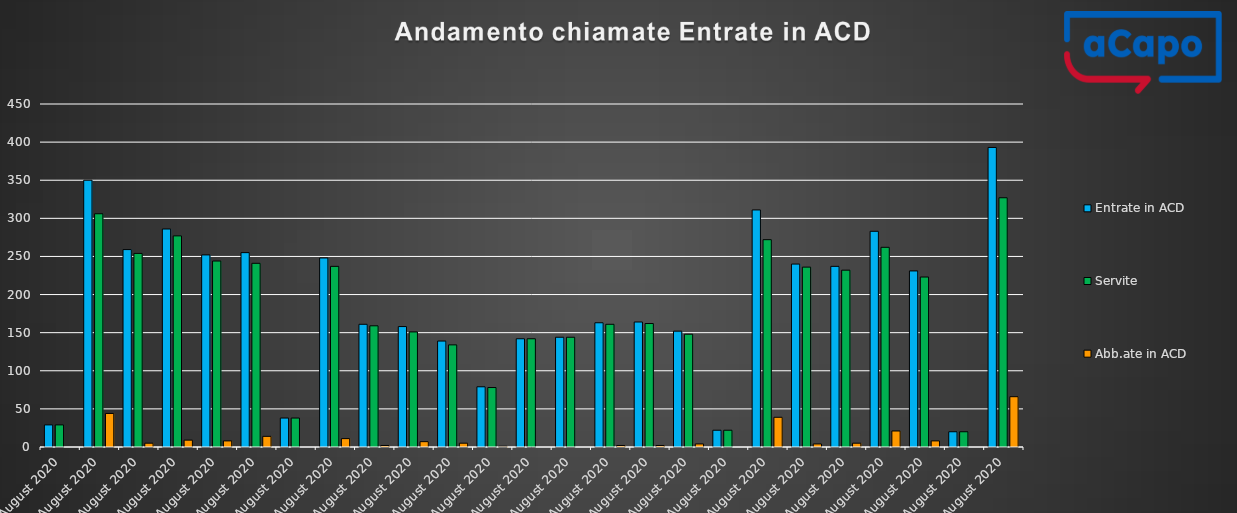
| Category | Entrate in ACD | Servite | Abb.ate in ACD |
|---|---|---|---|
| 2020-08-01 | 29 | 29 | 0 |
| 2020-08-03 | 350 | 306 | 44 |
| 2020-08-04 | 259 | 254 | 5 |
| 2020-08-05 | 286 | 277 | 9 |
| 2020-08-06 | 252 | 244 | 8 |
| 2020-08-07 | 255 | 241 | 14 |
| 2020-08-08 | 38 | 38 | 0 |
| 2020-08-10 | 248 | 237 | 11 |
| 2020-08-11 | 161 | 159 | 2 |
| 2020-08-12 | 158 | 151 | 7 |
| 2020-08-13 | 139 | 134 | 5 |
| 2020-08-14 | 79 | 78 | 1 |
| 2020-08-17 | 142 | 142 | 0 |
| 2020-08-18 | 144 | 144 | 0 |
| 2020-08-19 | 163 | 161 | 2 |
| 2020-08-20 | 164 | 162 | 2 |
| 2020-08-21 | 152 | 148 | 4 |
| 2020-08-22 | 22 | 22 | 0 |
| 2020-08-24 | 311 | 272 | 39 |
| 2020-08-25 | 240 | 236 | 4 |
| 2020-08-26 | 237 | 232 | 5 |
| 2020-08-27 | 283 | 262 | 21 |
| 2020-08-28 | 231 | 223 | 8 |
| 2020-08-29 | 20 | 20 | 0 |
| 2020-08-31 | 393 | 327 | 66 |